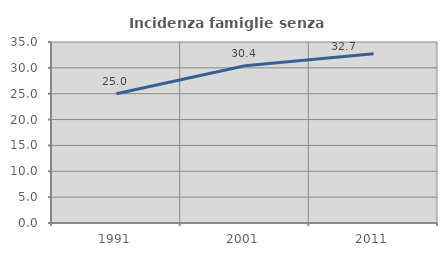
| Category | Incidenza famiglie senza nuclei |
|---|---|
| 1991.0 | 25 |
| 2001.0 | 30.412 |
| 2011.0 | 32.737 |